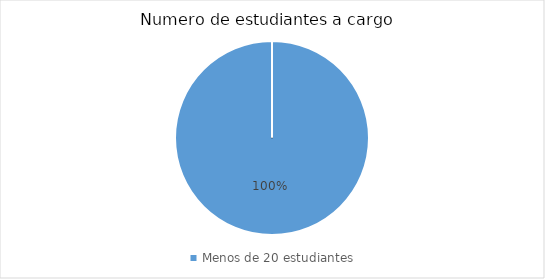
| Category | Menos de 20 estudiantes  |
|---|---|
| Menos de 20 estudiantes  | 7 |